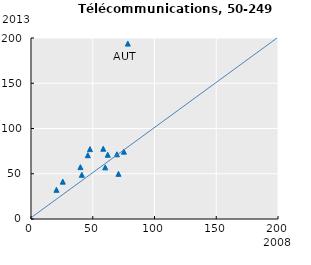
| Category | Series 0 |
|---|---|
| 78.40151688915394 | 193.808 |
| 58.513811936726185 | 77.667 |
| 20.606059648429785 | 32.258 |
| 70.82489609164112 | 49.919 |
| 62.13304405967375 | 71.006 |
| 25.721976750410757 | 41.284 |
| 60.108402124991855 | 57.05 |
| 47.749839577075505 | 77.222 |
| 41.1540318489059 | 48.849 |
| 69.55653457969484 | 71.501 |
| 46.00794892021669 | 70.477 |
| 39.99389551087408 | 57.35 |
| 75.20896837364475 | 74.421 |